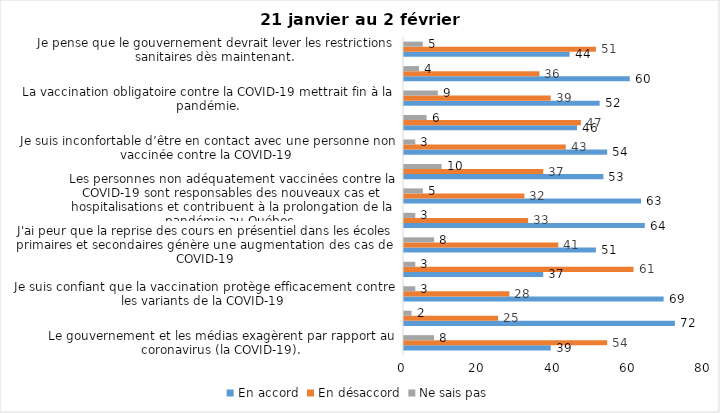
| Category | En accord | En désaccord | Ne sais pas |
|---|---|---|---|
| Le gouvernement et les médias exagèrent par rapport au coronavirus (la COVID-19). | 39 | 54 | 8 |
| J’ai peur que le système de santé soit débordé par les cas de COVID-19. | 72 | 25 | 2 |
| Je suis confiant que la vaccination protège efficacement contre les variants de la COVID-19 | 69 | 28 | 3 |
| Je suis favorable à ce que le port du masque ne soit plus obligatoire au Québec. | 37 | 61 | 3 |
| J'ai peur que la reprise des cours en présentiel dans les écoles primaires et secondaires génère une augmentation des cas de COVID-19 | 51 | 41 | 8 |
| Je crois que le passeport vaccinal devrait être requis pour davantage de services et commerces (ex. : spas, centre d’achats, centre de soins personnels. | 64 | 33 | 3 |
| Les personnes non adéquatement vaccinées contre la COVID-19 sont responsables des nouveaux cas et hospitalisations et contribuent à la prolongation de la pandémie au Québec. | 63 | 32 | 5 |
| La pandémie ne sera pas terminée au Québec avant que tous les habitants de la terre puissent être vaccinés contre la COVID-19.   | 53 | 37 | 10 |
| Je suis inconfortable d’être en contact avec une personne non vaccinée contre la COVID-19 | 54 | 43 | 3 |
| Je n'ai pas peur du variant Omicron, car il semble moins dangereux pour la santé. | 46 | 47 | 6 |
| La vaccination obligatoire contre la COVID-19 mettrait fin à la pandémie. | 52 | 39 | 9 |
| Je suis favorable à ce que les personnes non vaccinées paient une taxe supplémentaire (contribution santé). | 60 | 36 | 4 |
| Je pense que le gouvernement devrait lever les restrictions sanitaires dès maintenant. | 44 | 51 | 5 |